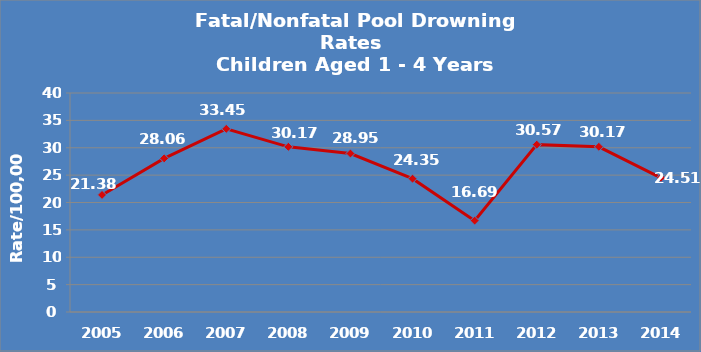
| Category | Series 0 |
|---|---|
| 2005.0 | 21.38 |
| 2006.0 | 28.06 |
| 2007.0 | 33.45 |
| 2008.0 | 30.17 |
| 2009.0 | 28.95 |
| 2010.0 | 24.35 |
| 2011.0 | 16.69 |
| 2012.0 | 30.57 |
| 2013.0 | 30.17 |
| 2014.0 | 24.51 |